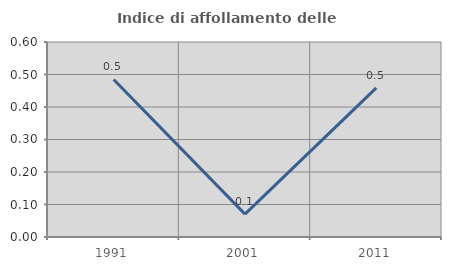
| Category | Indice di affollamento delle abitazioni  |
|---|---|
| 1991.0 | 0.485 |
| 2001.0 | 0.071 |
| 2011.0 | 0.459 |